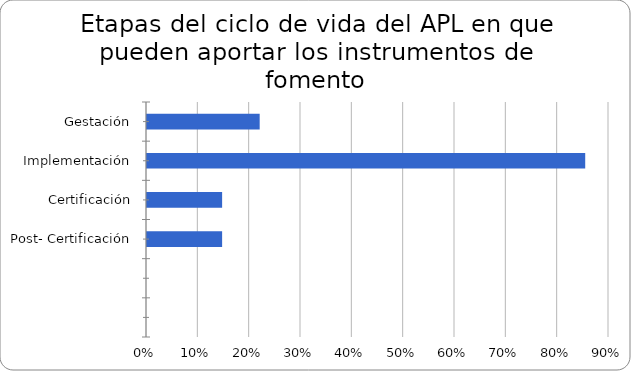
| Category | Series 0 |
|---|---|
| Gestación | 0.22 |
| Implementación | 0.854 |
| Certificación | 0.146 |
| Post- Certificación | 0.146 |